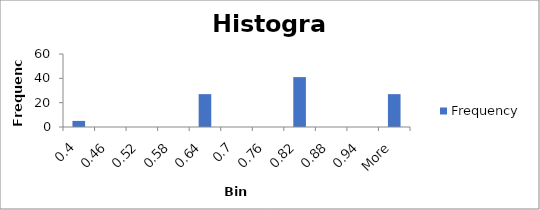
| Category | Frequency |
|---|---|
| 0.4 | 5 |
| 0.46 | 0 |
| 0.52 | 0 |
| 0.58 | 0 |
| 0.64 | 27 |
| 0.7 | 0 |
| 0.76 | 0 |
| 0.82 | 41 |
| 0.88 | 0 |
| 0.94 | 0 |
| More | 27 |